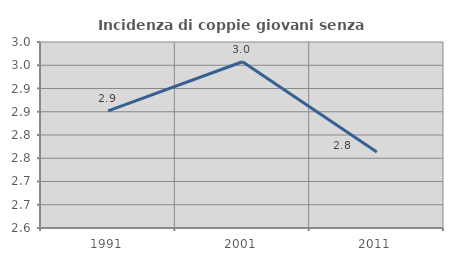
| Category | Incidenza di coppie giovani senza figli |
|---|---|
| 1991.0 | 2.852 |
| 2001.0 | 2.957 |
| 2011.0 | 2.763 |